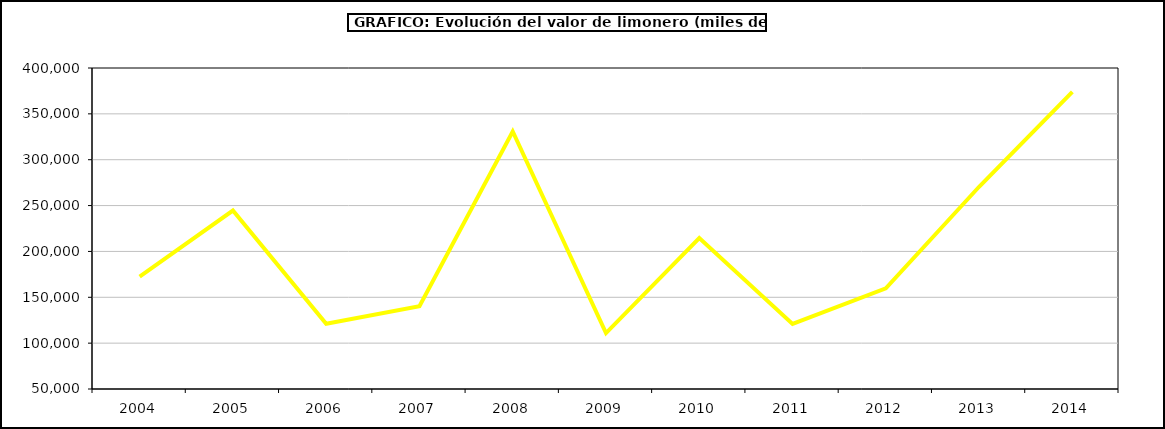
| Category | Valor |
|---|---|
| 2004.0 | 172504.993 |
| 2005.0 | 244618.04 |
| 2006.0 | 121132.205 |
| 2007.0 | 140203.613 |
| 2008.0 | 330828.422 |
| 2009.0 | 110910.366 |
| 2010.0 | 214653.894 |
| 2011.0 | 121030.951 |
| 2012.0 | 159689.894 |
| 2013.0 | 270510.614 |
| 2014.0 | 373950.238 |